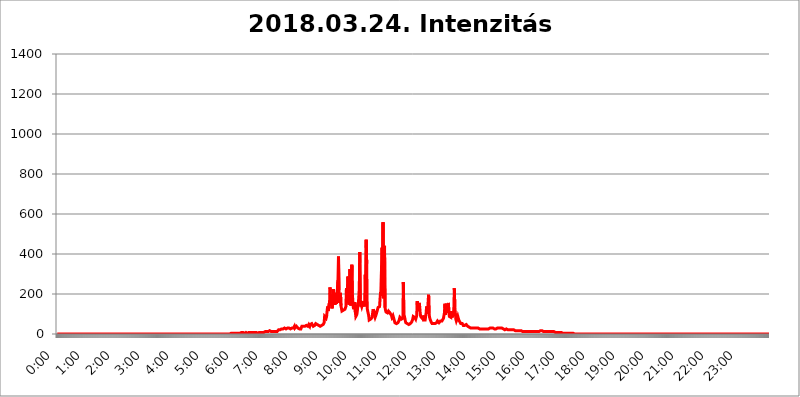
| Category | 2018.03.24. Intenzitás [W/m^2] |
|---|---|
| 0.0 | 0 |
| 0.0006944444444444445 | 0 |
| 0.001388888888888889 | 0 |
| 0.0020833333333333333 | 0 |
| 0.002777777777777778 | 0 |
| 0.003472222222222222 | 0 |
| 0.004166666666666667 | 0 |
| 0.004861111111111111 | 0 |
| 0.005555555555555556 | 0 |
| 0.0062499999999999995 | 0 |
| 0.006944444444444444 | 0 |
| 0.007638888888888889 | 0 |
| 0.008333333333333333 | 0 |
| 0.009027777777777779 | 0 |
| 0.009722222222222222 | 0 |
| 0.010416666666666666 | 0 |
| 0.011111111111111112 | 0 |
| 0.011805555555555555 | 0 |
| 0.012499999999999999 | 0 |
| 0.013194444444444444 | 0 |
| 0.013888888888888888 | 0 |
| 0.014583333333333332 | 0 |
| 0.015277777777777777 | 0 |
| 0.015972222222222224 | 0 |
| 0.016666666666666666 | 0 |
| 0.017361111111111112 | 0 |
| 0.018055555555555557 | 0 |
| 0.01875 | 0 |
| 0.019444444444444445 | 0 |
| 0.02013888888888889 | 0 |
| 0.020833333333333332 | 0 |
| 0.02152777777777778 | 0 |
| 0.022222222222222223 | 0 |
| 0.02291666666666667 | 0 |
| 0.02361111111111111 | 0 |
| 0.024305555555555556 | 0 |
| 0.024999999999999998 | 0 |
| 0.025694444444444447 | 0 |
| 0.02638888888888889 | 0 |
| 0.027083333333333334 | 0 |
| 0.027777777777777776 | 0 |
| 0.02847222222222222 | 0 |
| 0.029166666666666664 | 0 |
| 0.029861111111111113 | 0 |
| 0.030555555555555555 | 0 |
| 0.03125 | 0 |
| 0.03194444444444445 | 0 |
| 0.03263888888888889 | 0 |
| 0.03333333333333333 | 0 |
| 0.034027777777777775 | 0 |
| 0.034722222222222224 | 0 |
| 0.035416666666666666 | 0 |
| 0.036111111111111115 | 0 |
| 0.03680555555555556 | 0 |
| 0.0375 | 0 |
| 0.03819444444444444 | 0 |
| 0.03888888888888889 | 0 |
| 0.03958333333333333 | 0 |
| 0.04027777777777778 | 0 |
| 0.04097222222222222 | 0 |
| 0.041666666666666664 | 0 |
| 0.042361111111111106 | 0 |
| 0.04305555555555556 | 0 |
| 0.043750000000000004 | 0 |
| 0.044444444444444446 | 0 |
| 0.04513888888888889 | 0 |
| 0.04583333333333334 | 0 |
| 0.04652777777777778 | 0 |
| 0.04722222222222222 | 0 |
| 0.04791666666666666 | 0 |
| 0.04861111111111111 | 0 |
| 0.049305555555555554 | 0 |
| 0.049999999999999996 | 0 |
| 0.05069444444444445 | 0 |
| 0.051388888888888894 | 0 |
| 0.052083333333333336 | 0 |
| 0.05277777777777778 | 0 |
| 0.05347222222222222 | 0 |
| 0.05416666666666667 | 0 |
| 0.05486111111111111 | 0 |
| 0.05555555555555555 | 0 |
| 0.05625 | 0 |
| 0.05694444444444444 | 0 |
| 0.057638888888888885 | 0 |
| 0.05833333333333333 | 0 |
| 0.05902777777777778 | 0 |
| 0.059722222222222225 | 0 |
| 0.06041666666666667 | 0 |
| 0.061111111111111116 | 0 |
| 0.06180555555555556 | 0 |
| 0.0625 | 0 |
| 0.06319444444444444 | 0 |
| 0.06388888888888888 | 0 |
| 0.06458333333333334 | 0 |
| 0.06527777777777778 | 0 |
| 0.06597222222222222 | 0 |
| 0.06666666666666667 | 0 |
| 0.06736111111111111 | 0 |
| 0.06805555555555555 | 0 |
| 0.06874999999999999 | 0 |
| 0.06944444444444443 | 0 |
| 0.07013888888888889 | 0 |
| 0.07083333333333333 | 0 |
| 0.07152777777777779 | 0 |
| 0.07222222222222223 | 0 |
| 0.07291666666666667 | 0 |
| 0.07361111111111111 | 0 |
| 0.07430555555555556 | 0 |
| 0.075 | 0 |
| 0.07569444444444444 | 0 |
| 0.0763888888888889 | 0 |
| 0.07708333333333334 | 0 |
| 0.07777777777777778 | 0 |
| 0.07847222222222222 | 0 |
| 0.07916666666666666 | 0 |
| 0.0798611111111111 | 0 |
| 0.08055555555555556 | 0 |
| 0.08125 | 0 |
| 0.08194444444444444 | 0 |
| 0.08263888888888889 | 0 |
| 0.08333333333333333 | 0 |
| 0.08402777777777777 | 0 |
| 0.08472222222222221 | 0 |
| 0.08541666666666665 | 0 |
| 0.08611111111111112 | 0 |
| 0.08680555555555557 | 0 |
| 0.08750000000000001 | 0 |
| 0.08819444444444445 | 0 |
| 0.08888888888888889 | 0 |
| 0.08958333333333333 | 0 |
| 0.09027777777777778 | 0 |
| 0.09097222222222222 | 0 |
| 0.09166666666666667 | 0 |
| 0.09236111111111112 | 0 |
| 0.09305555555555556 | 0 |
| 0.09375 | 0 |
| 0.09444444444444444 | 0 |
| 0.09513888888888888 | 0 |
| 0.09583333333333333 | 0 |
| 0.09652777777777777 | 0 |
| 0.09722222222222222 | 0 |
| 0.09791666666666667 | 0 |
| 0.09861111111111111 | 0 |
| 0.09930555555555555 | 0 |
| 0.09999999999999999 | 0 |
| 0.10069444444444443 | 0 |
| 0.1013888888888889 | 0 |
| 0.10208333333333335 | 0 |
| 0.10277777777777779 | 0 |
| 0.10347222222222223 | 0 |
| 0.10416666666666667 | 0 |
| 0.10486111111111111 | 0 |
| 0.10555555555555556 | 0 |
| 0.10625 | 0 |
| 0.10694444444444444 | 0 |
| 0.1076388888888889 | 0 |
| 0.10833333333333334 | 0 |
| 0.10902777777777778 | 0 |
| 0.10972222222222222 | 0 |
| 0.1111111111111111 | 0 |
| 0.11180555555555556 | 0 |
| 0.11180555555555556 | 0 |
| 0.1125 | 0 |
| 0.11319444444444444 | 0 |
| 0.11388888888888889 | 0 |
| 0.11458333333333333 | 0 |
| 0.11527777777777777 | 0 |
| 0.11597222222222221 | 0 |
| 0.11666666666666665 | 0 |
| 0.1173611111111111 | 0 |
| 0.11805555555555557 | 0 |
| 0.11944444444444445 | 0 |
| 0.12013888888888889 | 0 |
| 0.12083333333333333 | 0 |
| 0.12152777777777778 | 0 |
| 0.12222222222222223 | 0 |
| 0.12291666666666667 | 0 |
| 0.12291666666666667 | 0 |
| 0.12361111111111112 | 0 |
| 0.12430555555555556 | 0 |
| 0.125 | 0 |
| 0.12569444444444444 | 0 |
| 0.12638888888888888 | 0 |
| 0.12708333333333333 | 0 |
| 0.16875 | 0 |
| 0.12847222222222224 | 0 |
| 0.12916666666666668 | 0 |
| 0.12986111111111112 | 0 |
| 0.13055555555555556 | 0 |
| 0.13125 | 0 |
| 0.13194444444444445 | 0 |
| 0.1326388888888889 | 0 |
| 0.13333333333333333 | 0 |
| 0.13402777777777777 | 0 |
| 0.13402777777777777 | 0 |
| 0.13472222222222222 | 0 |
| 0.13541666666666666 | 0 |
| 0.1361111111111111 | 0 |
| 0.13749999999999998 | 0 |
| 0.13819444444444443 | 0 |
| 0.1388888888888889 | 0 |
| 0.13958333333333334 | 0 |
| 0.14027777777777778 | 0 |
| 0.14097222222222222 | 0 |
| 0.14166666666666666 | 0 |
| 0.1423611111111111 | 0 |
| 0.14305555555555557 | 0 |
| 0.14375000000000002 | 0 |
| 0.14444444444444446 | 0 |
| 0.1451388888888889 | 0 |
| 0.1451388888888889 | 0 |
| 0.14652777777777778 | 0 |
| 0.14722222222222223 | 0 |
| 0.14791666666666667 | 0 |
| 0.1486111111111111 | 0 |
| 0.14930555555555555 | 0 |
| 0.15 | 0 |
| 0.15069444444444444 | 0 |
| 0.15138888888888888 | 0 |
| 0.15208333333333332 | 0 |
| 0.15277777777777776 | 0 |
| 0.15347222222222223 | 0 |
| 0.15416666666666667 | 0 |
| 0.15486111111111112 | 0 |
| 0.15555555555555556 | 0 |
| 0.15625 | 0 |
| 0.15694444444444444 | 0 |
| 0.15763888888888888 | 0 |
| 0.15833333333333333 | 0 |
| 0.15902777777777777 | 0 |
| 0.15972222222222224 | 0 |
| 0.16041666666666668 | 0 |
| 0.16111111111111112 | 0 |
| 0.16180555555555556 | 0 |
| 0.1625 | 0 |
| 0.16319444444444445 | 0 |
| 0.1638888888888889 | 0 |
| 0.16458333333333333 | 0 |
| 0.16527777777777777 | 0 |
| 0.16597222222222222 | 0 |
| 0.16666666666666666 | 0 |
| 0.1673611111111111 | 0 |
| 0.16805555555555554 | 0 |
| 0.16874999999999998 | 0 |
| 0.16944444444444443 | 0 |
| 0.17013888888888887 | 0 |
| 0.1708333333333333 | 0 |
| 0.17152777777777775 | 0 |
| 0.17222222222222225 | 0 |
| 0.1729166666666667 | 0 |
| 0.17361111111111113 | 0 |
| 0.17430555555555557 | 0 |
| 0.17500000000000002 | 0 |
| 0.17569444444444446 | 0 |
| 0.1763888888888889 | 0 |
| 0.17708333333333334 | 0 |
| 0.17777777777777778 | 0 |
| 0.17847222222222223 | 0 |
| 0.17916666666666667 | 0 |
| 0.1798611111111111 | 0 |
| 0.18055555555555555 | 0 |
| 0.18125 | 0 |
| 0.18194444444444444 | 0 |
| 0.1826388888888889 | 0 |
| 0.18333333333333335 | 0 |
| 0.1840277777777778 | 0 |
| 0.18472222222222223 | 0 |
| 0.18541666666666667 | 0 |
| 0.18611111111111112 | 0 |
| 0.18680555555555556 | 0 |
| 0.1875 | 0 |
| 0.18819444444444444 | 0 |
| 0.18888888888888888 | 0 |
| 0.18958333333333333 | 0 |
| 0.19027777777777777 | 0 |
| 0.1909722222222222 | 0 |
| 0.19166666666666665 | 0 |
| 0.19236111111111112 | 0 |
| 0.19305555555555554 | 0 |
| 0.19375 | 0 |
| 0.19444444444444445 | 0 |
| 0.1951388888888889 | 0 |
| 0.19583333333333333 | 0 |
| 0.19652777777777777 | 0 |
| 0.19722222222222222 | 0 |
| 0.19791666666666666 | 0 |
| 0.1986111111111111 | 0 |
| 0.19930555555555554 | 0 |
| 0.19999999999999998 | 0 |
| 0.20069444444444443 | 0 |
| 0.20138888888888887 | 0 |
| 0.2020833333333333 | 0 |
| 0.2027777777777778 | 0 |
| 0.2034722222222222 | 0 |
| 0.2041666666666667 | 0 |
| 0.20486111111111113 | 0 |
| 0.20555555555555557 | 0 |
| 0.20625000000000002 | 0 |
| 0.20694444444444446 | 0 |
| 0.2076388888888889 | 0 |
| 0.20833333333333334 | 0 |
| 0.20902777777777778 | 0 |
| 0.20972222222222223 | 0 |
| 0.21041666666666667 | 0 |
| 0.2111111111111111 | 0 |
| 0.21180555555555555 | 0 |
| 0.2125 | 0 |
| 0.21319444444444444 | 0 |
| 0.2138888888888889 | 0 |
| 0.21458333333333335 | 0 |
| 0.2152777777777778 | 0 |
| 0.21597222222222223 | 0 |
| 0.21666666666666667 | 0 |
| 0.21736111111111112 | 0 |
| 0.21805555555555556 | 0 |
| 0.21875 | 0 |
| 0.21944444444444444 | 0 |
| 0.22013888888888888 | 0 |
| 0.22083333333333333 | 0 |
| 0.22152777777777777 | 0 |
| 0.2222222222222222 | 0 |
| 0.22291666666666665 | 0 |
| 0.2236111111111111 | 0 |
| 0.22430555555555556 | 0 |
| 0.225 | 0 |
| 0.22569444444444445 | 0 |
| 0.2263888888888889 | 0 |
| 0.22708333333333333 | 0 |
| 0.22777777777777777 | 0 |
| 0.22847222222222222 | 0 |
| 0.22916666666666666 | 0 |
| 0.2298611111111111 | 0 |
| 0.23055555555555554 | 0 |
| 0.23124999999999998 | 0 |
| 0.23194444444444443 | 0 |
| 0.23263888888888887 | 0 |
| 0.2333333333333333 | 0 |
| 0.2340277777777778 | 0 |
| 0.2347222222222222 | 0 |
| 0.2354166666666667 | 0 |
| 0.23611111111111113 | 0 |
| 0.23680555555555557 | 0 |
| 0.23750000000000002 | 0 |
| 0.23819444444444446 | 0 |
| 0.2388888888888889 | 0 |
| 0.23958333333333334 | 0 |
| 0.24027777777777778 | 0 |
| 0.24097222222222223 | 0 |
| 0.24166666666666667 | 0 |
| 0.2423611111111111 | 0 |
| 0.24305555555555555 | 0 |
| 0.24375 | 3.525 |
| 0.24444444444444446 | 3.525 |
| 0.24513888888888888 | 3.525 |
| 0.24583333333333335 | 3.525 |
| 0.2465277777777778 | 0 |
| 0.24722222222222223 | 3.525 |
| 0.24791666666666667 | 3.525 |
| 0.24861111111111112 | 3.525 |
| 0.24930555555555556 | 3.525 |
| 0.25 | 3.525 |
| 0.25069444444444444 | 3.525 |
| 0.2513888888888889 | 3.525 |
| 0.2520833333333333 | 3.525 |
| 0.25277777777777777 | 3.525 |
| 0.2534722222222222 | 3.525 |
| 0.25416666666666665 | 3.525 |
| 0.2548611111111111 | 3.525 |
| 0.2555555555555556 | 3.525 |
| 0.25625000000000003 | 3.525 |
| 0.2569444444444445 | 3.525 |
| 0.2576388888888889 | 3.525 |
| 0.25833333333333336 | 7.887 |
| 0.2590277777777778 | 7.887 |
| 0.25972222222222224 | 7.887 |
| 0.2604166666666667 | 7.887 |
| 0.2611111111111111 | 3.525 |
| 0.26180555555555557 | 3.525 |
| 0.2625 | 3.525 |
| 0.26319444444444445 | 7.887 |
| 0.2638888888888889 | 7.887 |
| 0.26458333333333334 | 7.887 |
| 0.2652777777777778 | 3.525 |
| 0.2659722222222222 | 3.525 |
| 0.26666666666666666 | 3.525 |
| 0.2673611111111111 | 7.887 |
| 0.26805555555555555 | 7.887 |
| 0.26875 | 7.887 |
| 0.26944444444444443 | 7.887 |
| 0.2701388888888889 | 7.887 |
| 0.2708333333333333 | 7.887 |
| 0.27152777777777776 | 7.887 |
| 0.2722222222222222 | 12.257 |
| 0.27291666666666664 | 7.887 |
| 0.2736111111111111 | 7.887 |
| 0.2743055555555555 | 7.887 |
| 0.27499999999999997 | 7.887 |
| 0.27569444444444446 | 7.887 |
| 0.27638888888888885 | 7.887 |
| 0.27708333333333335 | 7.887 |
| 0.2777777777777778 | 7.887 |
| 0.27847222222222223 | 7.887 |
| 0.2791666666666667 | 7.887 |
| 0.2798611111111111 | 7.887 |
| 0.28055555555555556 | 7.887 |
| 0.28125 | 3.525 |
| 0.28194444444444444 | 3.525 |
| 0.2826388888888889 | 7.887 |
| 0.2833333333333333 | 7.887 |
| 0.28402777777777777 | 7.887 |
| 0.2847222222222222 | 12.257 |
| 0.28541666666666665 | 7.887 |
| 0.28611111111111115 | 12.257 |
| 0.28680555555555554 | 7.887 |
| 0.28750000000000003 | 7.887 |
| 0.2881944444444445 | 7.887 |
| 0.2888888888888889 | 7.887 |
| 0.28958333333333336 | 7.887 |
| 0.2902777777777778 | 12.257 |
| 0.29097222222222224 | 12.257 |
| 0.2916666666666667 | 12.257 |
| 0.2923611111111111 | 12.257 |
| 0.29305555555555557 | 12.257 |
| 0.29375 | 12.257 |
| 0.29444444444444445 | 12.257 |
| 0.2951388888888889 | 12.257 |
| 0.29583333333333334 | 12.257 |
| 0.2965277777777778 | 12.257 |
| 0.2972222222222222 | 12.257 |
| 0.29791666666666666 | 16.636 |
| 0.2986111111111111 | 16.636 |
| 0.29930555555555555 | 16.636 |
| 0.3 | 12.257 |
| 0.30069444444444443 | 12.257 |
| 0.3013888888888889 | 12.257 |
| 0.3020833333333333 | 12.257 |
| 0.30277777777777776 | 12.257 |
| 0.3034722222222222 | 12.257 |
| 0.30416666666666664 | 12.257 |
| 0.3048611111111111 | 12.257 |
| 0.3055555555555555 | 12.257 |
| 0.30624999999999997 | 12.257 |
| 0.3069444444444444 | 16.636 |
| 0.3076388888888889 | 16.636 |
| 0.30833333333333335 | 12.257 |
| 0.3090277777777778 | 12.257 |
| 0.30972222222222223 | 16.636 |
| 0.3104166666666667 | 21.024 |
| 0.3111111111111111 | 21.024 |
| 0.31180555555555556 | 21.024 |
| 0.3125 | 21.024 |
| 0.31319444444444444 | 25.419 |
| 0.3138888888888889 | 25.419 |
| 0.3145833333333333 | 25.419 |
| 0.31527777777777777 | 21.024 |
| 0.3159722222222222 | 21.024 |
| 0.31666666666666665 | 25.419 |
| 0.31736111111111115 | 29.823 |
| 0.31805555555555554 | 29.823 |
| 0.31875000000000003 | 29.823 |
| 0.3194444444444445 | 29.823 |
| 0.3201388888888889 | 25.419 |
| 0.32083333333333336 | 25.419 |
| 0.3215277777777778 | 25.419 |
| 0.32222222222222224 | 25.419 |
| 0.3229166666666667 | 29.823 |
| 0.3236111111111111 | 29.823 |
| 0.32430555555555557 | 29.823 |
| 0.325 | 29.823 |
| 0.32569444444444445 | 29.823 |
| 0.3263888888888889 | 29.823 |
| 0.32708333333333334 | 25.419 |
| 0.3277777777777778 | 29.823 |
| 0.3284722222222222 | 29.823 |
| 0.32916666666666666 | 29.823 |
| 0.3298611111111111 | 29.823 |
| 0.33055555555555555 | 29.823 |
| 0.33125 | 29.823 |
| 0.33194444444444443 | 34.234 |
| 0.3326388888888889 | 38.653 |
| 0.3333333333333333 | 29.823 |
| 0.3340277777777778 | 29.823 |
| 0.3347222222222222 | 34.234 |
| 0.3354166666666667 | 38.653 |
| 0.3361111111111111 | 43.079 |
| 0.3368055555555556 | 38.653 |
| 0.33749999999999997 | 29.823 |
| 0.33819444444444446 | 25.419 |
| 0.33888888888888885 | 25.419 |
| 0.33958333333333335 | 25.419 |
| 0.34027777777777773 | 25.419 |
| 0.34097222222222223 | 25.419 |
| 0.3416666666666666 | 25.419 |
| 0.3423611111111111 | 29.823 |
| 0.3430555555555555 | 38.653 |
| 0.34375 | 38.653 |
| 0.3444444444444445 | 43.079 |
| 0.3451388888888889 | 38.653 |
| 0.3458333333333334 | 38.653 |
| 0.34652777777777777 | 38.653 |
| 0.34722222222222227 | 38.653 |
| 0.34791666666666665 | 38.653 |
| 0.34861111111111115 | 38.653 |
| 0.34930555555555554 | 43.079 |
| 0.35000000000000003 | 38.653 |
| 0.3506944444444444 | 38.653 |
| 0.3513888888888889 | 38.653 |
| 0.3520833333333333 | 43.079 |
| 0.3527777777777778 | 47.511 |
| 0.3534722222222222 | 43.079 |
| 0.3541666666666667 | 38.653 |
| 0.3548611111111111 | 47.511 |
| 0.35555555555555557 | 51.951 |
| 0.35625 | 47.511 |
| 0.35694444444444445 | 51.951 |
| 0.3576388888888889 | 56.398 |
| 0.35833333333333334 | 47.511 |
| 0.3590277777777778 | 38.653 |
| 0.3597222222222222 | 43.079 |
| 0.36041666666666666 | 43.079 |
| 0.3611111111111111 | 43.079 |
| 0.36180555555555555 | 47.511 |
| 0.3625 | 51.951 |
| 0.36319444444444443 | 47.511 |
| 0.3638888888888889 | 47.511 |
| 0.3645833333333333 | 47.511 |
| 0.3652777777777778 | 43.079 |
| 0.3659722222222222 | 43.079 |
| 0.3666666666666667 | 43.079 |
| 0.3673611111111111 | 38.653 |
| 0.3680555555555556 | 38.653 |
| 0.36874999999999997 | 38.653 |
| 0.36944444444444446 | 43.079 |
| 0.37013888888888885 | 43.079 |
| 0.37083333333333335 | 43.079 |
| 0.37152777777777773 | 47.511 |
| 0.37222222222222223 | 47.511 |
| 0.3729166666666666 | 47.511 |
| 0.3736111111111111 | 51.951 |
| 0.3743055555555555 | 56.398 |
| 0.375 | 87.692 |
| 0.3756944444444445 | 83.205 |
| 0.3763888888888889 | 92.184 |
| 0.3770833333333334 | 78.722 |
| 0.37777777777777777 | 87.692 |
| 0.37847222222222227 | 114.716 |
| 0.37916666666666665 | 137.347 |
| 0.37986111111111115 | 114.716 |
| 0.38055555555555554 | 114.716 |
| 0.38125000000000003 | 119.235 |
| 0.3819444444444444 | 160.056 |
| 0.3826388888888889 | 233 |
| 0.3833333333333333 | 178.264 |
| 0.3840277777777778 | 141.884 |
| 0.3847222222222222 | 164.605 |
| 0.3854166666666667 | 128.284 |
| 0.3861111111111111 | 128.284 |
| 0.38680555555555557 | 173.709 |
| 0.3875 | 223.873 |
| 0.38819444444444445 | 150.964 |
| 0.3888888888888889 | 164.605 |
| 0.38958333333333334 | 146.423 |
| 0.3902777777777778 | 178.264 |
| 0.3909722222222222 | 205.62 |
| 0.39166666666666666 | 150.964 |
| 0.3923611111111111 | 146.423 |
| 0.39305555555555555 | 155.509 |
| 0.39375 | 269.49 |
| 0.39444444444444443 | 387.202 |
| 0.3951388888888889 | 219.309 |
| 0.3958333333333333 | 155.509 |
| 0.3965277777777778 | 196.497 |
| 0.3972222222222222 | 205.62 |
| 0.3979166666666667 | 141.884 |
| 0.3986111111111111 | 128.284 |
| 0.3993055555555556 | 114.716 |
| 0.39999999999999997 | 110.201 |
| 0.40069444444444446 | 114.716 |
| 0.40138888888888885 | 119.235 |
| 0.40208333333333335 | 123.758 |
| 0.40277777777777773 | 123.758 |
| 0.40347222222222223 | 123.758 |
| 0.4041666666666666 | 128.284 |
| 0.4048611111111111 | 137.347 |
| 0.4055555555555555 | 228.436 |
| 0.40625 | 182.82 |
| 0.4069444444444445 | 214.746 |
| 0.4076388888888889 | 287.709 |
| 0.4083333333333334 | 164.605 |
| 0.40902777777777777 | 146.423 |
| 0.40972222222222227 | 155.509 |
| 0.41041666666666665 | 324.052 |
| 0.41111111111111115 | 155.509 |
| 0.41180555555555554 | 141.884 |
| 0.41250000000000003 | 141.884 |
| 0.4131944444444444 | 346.682 |
| 0.4138888888888889 | 201.058 |
| 0.4145833333333333 | 164.605 |
| 0.4152777777777778 | 132.814 |
| 0.4159722222222222 | 123.758 |
| 0.4166666666666667 | 137.347 |
| 0.4173611111111111 | 160.056 |
| 0.41805555555555557 | 110.201 |
| 0.41875 | 87.692 |
| 0.41944444444444445 | 83.205 |
| 0.4201388888888889 | 96.682 |
| 0.42083333333333334 | 114.716 |
| 0.4215277777777778 | 137.347 |
| 0.4222222222222222 | 150.964 |
| 0.42291666666666666 | 182.82 |
| 0.4236111111111111 | 228.436 |
| 0.42430555555555555 | 409.574 |
| 0.425 | 173.709 |
| 0.42569444444444443 | 137.347 |
| 0.4263888888888889 | 146.423 |
| 0.4270833333333333 | 137.347 |
| 0.4277777777777778 | 141.884 |
| 0.4284722222222222 | 155.509 |
| 0.4291666666666667 | 164.605 |
| 0.4298611111111111 | 146.423 |
| 0.4305555555555556 | 137.347 |
| 0.43124999999999997 | 164.605 |
| 0.43194444444444446 | 296.808 |
| 0.43263888888888885 | 219.309 |
| 0.43333333333333335 | 471.582 |
| 0.43402777777777773 | 351.198 |
| 0.43472222222222223 | 128.284 |
| 0.4354166666666666 | 114.716 |
| 0.4361111111111111 | 114.716 |
| 0.4368055555555555 | 92.184 |
| 0.4375 | 69.775 |
| 0.4381944444444445 | 65.31 |
| 0.4388888888888889 | 65.31 |
| 0.4395833333333334 | 74.246 |
| 0.44027777777777777 | 78.722 |
| 0.44097222222222227 | 78.722 |
| 0.44166666666666665 | 83.205 |
| 0.44236111111111115 | 105.69 |
| 0.44305555555555554 | 123.758 |
| 0.44375000000000003 | 123.758 |
| 0.4444444444444444 | 110.201 |
| 0.4451388888888889 | 92.184 |
| 0.4458333333333333 | 83.205 |
| 0.4465277777777778 | 87.692 |
| 0.4472222222222222 | 96.682 |
| 0.4479166666666667 | 105.69 |
| 0.4486111111111111 | 114.716 |
| 0.44930555555555557 | 123.758 |
| 0.45 | 132.814 |
| 0.45069444444444445 | 128.284 |
| 0.4513888888888889 | 128.284 |
| 0.45208333333333334 | 137.347 |
| 0.4527777777777778 | 178.264 |
| 0.4534722222222222 | 210.182 |
| 0.45416666666666666 | 191.937 |
| 0.4548611111111111 | 342.162 |
| 0.45555555555555555 | 431.833 |
| 0.45625 | 264.932 |
| 0.45694444444444443 | 558.261 |
| 0.4576388888888889 | 178.264 |
| 0.4583333333333333 | 396.164 |
| 0.4590277777777778 | 440.702 |
| 0.4597222222222222 | 132.814 |
| 0.4604166666666667 | 119.235 |
| 0.4611111111111111 | 110.201 |
| 0.4618055555555556 | 110.201 |
| 0.46249999999999997 | 110.201 |
| 0.46319444444444446 | 105.69 |
| 0.46388888888888885 | 110.201 |
| 0.46458333333333335 | 114.716 |
| 0.46527777777777773 | 110.201 |
| 0.46597222222222223 | 119.235 |
| 0.4666666666666666 | 105.69 |
| 0.4673611111111111 | 105.69 |
| 0.4680555555555555 | 101.184 |
| 0.46875 | 92.184 |
| 0.4694444444444445 | 83.205 |
| 0.4701388888888889 | 87.692 |
| 0.4708333333333334 | 92.184 |
| 0.47152777777777777 | 87.692 |
| 0.47222222222222227 | 74.246 |
| 0.47291666666666665 | 65.31 |
| 0.47361111111111115 | 56.398 |
| 0.47430555555555554 | 51.951 |
| 0.47500000000000003 | 51.951 |
| 0.4756944444444444 | 51.951 |
| 0.4763888888888889 | 56.398 |
| 0.4770833333333333 | 56.398 |
| 0.4777777777777778 | 56.398 |
| 0.4784722222222222 | 60.85 |
| 0.4791666666666667 | 65.31 |
| 0.4798611111111111 | 74.246 |
| 0.48055555555555557 | 83.205 |
| 0.48125 | 83.205 |
| 0.48194444444444445 | 78.722 |
| 0.4826388888888889 | 74.246 |
| 0.48333333333333334 | 69.775 |
| 0.4840277777777778 | 69.775 |
| 0.4847222222222222 | 78.722 |
| 0.48541666666666666 | 260.373 |
| 0.4861111111111111 | 101.184 |
| 0.48680555555555555 | 96.682 |
| 0.4875 | 78.722 |
| 0.48819444444444443 | 65.31 |
| 0.4888888888888889 | 56.398 |
| 0.4895833333333333 | 51.951 |
| 0.4902777777777778 | 51.951 |
| 0.4909722222222222 | 51.951 |
| 0.4916666666666667 | 47.511 |
| 0.4923611111111111 | 47.511 |
| 0.4930555555555556 | 47.511 |
| 0.49374999999999997 | 47.511 |
| 0.49444444444444446 | 51.951 |
| 0.49513888888888885 | 51.951 |
| 0.49583333333333335 | 51.951 |
| 0.49652777777777773 | 56.398 |
| 0.49722222222222223 | 60.85 |
| 0.4979166666666666 | 65.31 |
| 0.4986111111111111 | 74.246 |
| 0.4993055555555555 | 87.692 |
| 0.5 | 92.184 |
| 0.5006944444444444 | 83.205 |
| 0.5013888888888889 | 83.205 |
| 0.5020833333333333 | 78.722 |
| 0.5027777777777778 | 74.246 |
| 0.5034722222222222 | 78.722 |
| 0.5041666666666667 | 92.184 |
| 0.5048611111111111 | 164.605 |
| 0.5055555555555555 | 114.716 |
| 0.50625 | 114.716 |
| 0.5069444444444444 | 132.814 |
| 0.5076388888888889 | 155.509 |
| 0.5083333333333333 | 137.347 |
| 0.5090277777777777 | 105.69 |
| 0.5097222222222222 | 87.692 |
| 0.5104166666666666 | 83.205 |
| 0.5111111111111112 | 83.205 |
| 0.5118055555555555 | 78.722 |
| 0.5125000000000001 | 92.184 |
| 0.5131944444444444 | 83.205 |
| 0.513888888888889 | 69.775 |
| 0.5145833333333333 | 65.31 |
| 0.5152777777777778 | 65.31 |
| 0.5159722222222222 | 69.775 |
| 0.5166666666666667 | 74.246 |
| 0.517361111111111 | 105.69 |
| 0.5180555555555556 | 137.347 |
| 0.5187499999999999 | 101.184 |
| 0.5194444444444445 | 119.235 |
| 0.5201388888888888 | 123.758 |
| 0.5208333333333334 | 196.497 |
| 0.5215277777777778 | 101.184 |
| 0.5222222222222223 | 83.205 |
| 0.5229166666666667 | 74.246 |
| 0.5236111111111111 | 69.775 |
| 0.5243055555555556 | 60.85 |
| 0.525 | 56.398 |
| 0.5256944444444445 | 51.951 |
| 0.5263888888888889 | 51.951 |
| 0.5270833333333333 | 51.951 |
| 0.5277777777777778 | 51.951 |
| 0.5284722222222222 | 51.951 |
| 0.5291666666666667 | 51.951 |
| 0.5298611111111111 | 51.951 |
| 0.5305555555555556 | 51.951 |
| 0.53125 | 56.398 |
| 0.5319444444444444 | 56.398 |
| 0.5326388888888889 | 60.85 |
| 0.5333333333333333 | 65.31 |
| 0.5340277777777778 | 60.85 |
| 0.5347222222222222 | 60.85 |
| 0.5354166666666667 | 56.398 |
| 0.5361111111111111 | 56.398 |
| 0.5368055555555555 | 60.85 |
| 0.5375 | 65.31 |
| 0.5381944444444444 | 65.31 |
| 0.5388888888888889 | 65.31 |
| 0.5395833333333333 | 65.31 |
| 0.5402777777777777 | 65.31 |
| 0.5409722222222222 | 69.775 |
| 0.5416666666666666 | 78.722 |
| 0.5423611111111112 | 92.184 |
| 0.5430555555555555 | 105.69 |
| 0.5437500000000001 | 150.964 |
| 0.5444444444444444 | 96.682 |
| 0.545138888888889 | 101.184 |
| 0.5458333333333333 | 150.964 |
| 0.5465277777777778 | 105.69 |
| 0.5472222222222222 | 105.69 |
| 0.5479166666666667 | 119.235 |
| 0.548611111111111 | 155.509 |
| 0.5493055555555556 | 105.69 |
| 0.5499999999999999 | 87.692 |
| 0.5506944444444445 | 92.184 |
| 0.5513888888888888 | 87.692 |
| 0.5520833333333334 | 83.205 |
| 0.5527777777777778 | 114.716 |
| 0.5534722222222223 | 83.205 |
| 0.5541666666666667 | 78.722 |
| 0.5548611111111111 | 87.692 |
| 0.5555555555555556 | 101.184 |
| 0.55625 | 128.284 |
| 0.5569444444444445 | 228.436 |
| 0.5576388888888889 | 132.814 |
| 0.5583333333333333 | 105.69 |
| 0.5590277777777778 | 74.246 |
| 0.5597222222222222 | 65.31 |
| 0.5604166666666667 | 69.775 |
| 0.5611111111111111 | 78.722 |
| 0.5618055555555556 | 87.692 |
| 0.5625 | 83.205 |
| 0.5631944444444444 | 69.775 |
| 0.5638888888888889 | 65.31 |
| 0.5645833333333333 | 60.85 |
| 0.5652777777777778 | 56.398 |
| 0.5659722222222222 | 51.951 |
| 0.5666666666666667 | 51.951 |
| 0.5673611111111111 | 51.951 |
| 0.5680555555555555 | 51.951 |
| 0.56875 | 47.511 |
| 0.5694444444444444 | 43.079 |
| 0.5701388888888889 | 43.079 |
| 0.5708333333333333 | 43.079 |
| 0.5715277777777777 | 43.079 |
| 0.5722222222222222 | 47.511 |
| 0.5729166666666666 | 47.511 |
| 0.5736111111111112 | 47.511 |
| 0.5743055555555555 | 43.079 |
| 0.5750000000000001 | 43.079 |
| 0.5756944444444444 | 38.653 |
| 0.576388888888889 | 38.653 |
| 0.5770833333333333 | 38.653 |
| 0.5777777777777778 | 34.234 |
| 0.5784722222222222 | 34.234 |
| 0.5791666666666667 | 29.823 |
| 0.579861111111111 | 29.823 |
| 0.5805555555555556 | 29.823 |
| 0.5812499999999999 | 29.823 |
| 0.5819444444444445 | 29.823 |
| 0.5826388888888888 | 29.823 |
| 0.5833333333333334 | 29.823 |
| 0.5840277777777778 | 29.823 |
| 0.5847222222222223 | 29.823 |
| 0.5854166666666667 | 29.823 |
| 0.5861111111111111 | 29.823 |
| 0.5868055555555556 | 29.823 |
| 0.5875 | 29.823 |
| 0.5881944444444445 | 29.823 |
| 0.5888888888888889 | 29.823 |
| 0.5895833333333333 | 29.823 |
| 0.5902777777777778 | 29.823 |
| 0.5909722222222222 | 25.419 |
| 0.5916666666666667 | 25.419 |
| 0.5923611111111111 | 25.419 |
| 0.5930555555555556 | 25.419 |
| 0.59375 | 25.419 |
| 0.5944444444444444 | 25.419 |
| 0.5951388888888889 | 25.419 |
| 0.5958333333333333 | 25.419 |
| 0.5965277777777778 | 25.419 |
| 0.5972222222222222 | 25.419 |
| 0.5979166666666667 | 25.419 |
| 0.5986111111111111 | 25.419 |
| 0.5993055555555555 | 25.419 |
| 0.6 | 25.419 |
| 0.6006944444444444 | 25.419 |
| 0.6013888888888889 | 25.419 |
| 0.6020833333333333 | 25.419 |
| 0.6027777777777777 | 25.419 |
| 0.6034722222222222 | 25.419 |
| 0.6041666666666666 | 29.823 |
| 0.6048611111111112 | 25.419 |
| 0.6055555555555555 | 29.823 |
| 0.6062500000000001 | 29.823 |
| 0.6069444444444444 | 29.823 |
| 0.607638888888889 | 29.823 |
| 0.6083333333333333 | 29.823 |
| 0.6090277777777778 | 29.823 |
| 0.6097222222222222 | 29.823 |
| 0.6104166666666667 | 29.823 |
| 0.611111111111111 | 29.823 |
| 0.6118055555555556 | 25.419 |
| 0.6124999999999999 | 25.419 |
| 0.6131944444444445 | 25.419 |
| 0.6138888888888888 | 25.419 |
| 0.6145833333333334 | 25.419 |
| 0.6152777777777778 | 25.419 |
| 0.6159722222222223 | 29.823 |
| 0.6166666666666667 | 29.823 |
| 0.6173611111111111 | 29.823 |
| 0.6180555555555556 | 29.823 |
| 0.61875 | 29.823 |
| 0.6194444444444445 | 29.823 |
| 0.6201388888888889 | 29.823 |
| 0.6208333333333333 | 29.823 |
| 0.6215277777777778 | 29.823 |
| 0.6222222222222222 | 29.823 |
| 0.6229166666666667 | 29.823 |
| 0.6236111111111111 | 29.823 |
| 0.6243055555555556 | 29.823 |
| 0.625 | 25.419 |
| 0.6256944444444444 | 25.419 |
| 0.6263888888888889 | 25.419 |
| 0.6270833333333333 | 25.419 |
| 0.6277777777777778 | 21.024 |
| 0.6284722222222222 | 25.419 |
| 0.6291666666666667 | 25.419 |
| 0.6298611111111111 | 25.419 |
| 0.6305555555555555 | 21.024 |
| 0.63125 | 25.419 |
| 0.6319444444444444 | 21.024 |
| 0.6326388888888889 | 21.024 |
| 0.6333333333333333 | 21.024 |
| 0.6340277777777777 | 21.024 |
| 0.6347222222222222 | 21.024 |
| 0.6354166666666666 | 21.024 |
| 0.6361111111111112 | 21.024 |
| 0.6368055555555555 | 21.024 |
| 0.6375000000000001 | 21.024 |
| 0.6381944444444444 | 21.024 |
| 0.638888888888889 | 21.024 |
| 0.6395833333333333 | 21.024 |
| 0.6402777777777778 | 21.024 |
| 0.6409722222222222 | 21.024 |
| 0.6416666666666667 | 16.636 |
| 0.642361111111111 | 16.636 |
| 0.6430555555555556 | 16.636 |
| 0.6437499999999999 | 16.636 |
| 0.6444444444444445 | 16.636 |
| 0.6451388888888888 | 16.636 |
| 0.6458333333333334 | 16.636 |
| 0.6465277777777778 | 16.636 |
| 0.6472222222222223 | 16.636 |
| 0.6479166666666667 | 16.636 |
| 0.6486111111111111 | 16.636 |
| 0.6493055555555556 | 16.636 |
| 0.65 | 16.636 |
| 0.6506944444444445 | 16.636 |
| 0.6513888888888889 | 12.257 |
| 0.6520833333333333 | 12.257 |
| 0.6527777777777778 | 12.257 |
| 0.6534722222222222 | 12.257 |
| 0.6541666666666667 | 12.257 |
| 0.6548611111111111 | 12.257 |
| 0.6555555555555556 | 12.257 |
| 0.65625 | 12.257 |
| 0.6569444444444444 | 12.257 |
| 0.6576388888888889 | 12.257 |
| 0.6583333333333333 | 12.257 |
| 0.6590277777777778 | 12.257 |
| 0.6597222222222222 | 12.257 |
| 0.6604166666666667 | 12.257 |
| 0.6611111111111111 | 12.257 |
| 0.6618055555555555 | 12.257 |
| 0.6625 | 12.257 |
| 0.6631944444444444 | 12.257 |
| 0.6638888888888889 | 12.257 |
| 0.6645833333333333 | 12.257 |
| 0.6652777777777777 | 12.257 |
| 0.6659722222222222 | 12.257 |
| 0.6666666666666666 | 12.257 |
| 0.6673611111111111 | 12.257 |
| 0.6680555555555556 | 12.257 |
| 0.6687500000000001 | 12.257 |
| 0.6694444444444444 | 12.257 |
| 0.6701388888888888 | 12.257 |
| 0.6708333333333334 | 12.257 |
| 0.6715277777777778 | 12.257 |
| 0.6722222222222222 | 12.257 |
| 0.6729166666666666 | 12.257 |
| 0.6736111111111112 | 12.257 |
| 0.6743055555555556 | 12.257 |
| 0.6749999999999999 | 16.636 |
| 0.6756944444444444 | 12.257 |
| 0.6763888888888889 | 16.636 |
| 0.6770833333333334 | 16.636 |
| 0.6777777777777777 | 16.636 |
| 0.6784722222222223 | 16.636 |
| 0.6791666666666667 | 16.636 |
| 0.6798611111111111 | 16.636 |
| 0.6805555555555555 | 16.636 |
| 0.68125 | 16.636 |
| 0.6819444444444445 | 12.257 |
| 0.6826388888888889 | 12.257 |
| 0.6833333333333332 | 12.257 |
| 0.6840277777777778 | 12.257 |
| 0.6847222222222222 | 12.257 |
| 0.6854166666666667 | 12.257 |
| 0.686111111111111 | 12.257 |
| 0.6868055555555556 | 12.257 |
| 0.6875 | 12.257 |
| 0.6881944444444444 | 12.257 |
| 0.688888888888889 | 12.257 |
| 0.6895833333333333 | 12.257 |
| 0.6902777777777778 | 12.257 |
| 0.6909722222222222 | 12.257 |
| 0.6916666666666668 | 12.257 |
| 0.6923611111111111 | 12.257 |
| 0.6930555555555555 | 12.257 |
| 0.69375 | 12.257 |
| 0.6944444444444445 | 12.257 |
| 0.6951388888888889 | 12.257 |
| 0.6958333333333333 | 12.257 |
| 0.6965277777777777 | 12.257 |
| 0.6972222222222223 | 7.887 |
| 0.6979166666666666 | 7.887 |
| 0.6986111111111111 | 7.887 |
| 0.6993055555555556 | 7.887 |
| 0.7000000000000001 | 7.887 |
| 0.7006944444444444 | 7.887 |
| 0.7013888888888888 | 7.887 |
| 0.7020833333333334 | 7.887 |
| 0.7027777777777778 | 7.887 |
| 0.7034722222222222 | 7.887 |
| 0.7041666666666666 | 7.887 |
| 0.7048611111111112 | 7.887 |
| 0.7055555555555556 | 7.887 |
| 0.7062499999999999 | 7.887 |
| 0.7069444444444444 | 7.887 |
| 0.7076388888888889 | 3.525 |
| 0.7083333333333334 | 3.525 |
| 0.7090277777777777 | 3.525 |
| 0.7097222222222223 | 3.525 |
| 0.7104166666666667 | 3.525 |
| 0.7111111111111111 | 3.525 |
| 0.7118055555555555 | 3.525 |
| 0.7125 | 3.525 |
| 0.7131944444444445 | 3.525 |
| 0.7138888888888889 | 3.525 |
| 0.7145833333333332 | 3.525 |
| 0.7152777777777778 | 3.525 |
| 0.7159722222222222 | 3.525 |
| 0.7166666666666667 | 3.525 |
| 0.717361111111111 | 3.525 |
| 0.7180555555555556 | 3.525 |
| 0.71875 | 3.525 |
| 0.7194444444444444 | 3.525 |
| 0.720138888888889 | 3.525 |
| 0.7208333333333333 | 3.525 |
| 0.7215277777777778 | 3.525 |
| 0.7222222222222222 | 3.525 |
| 0.7229166666666668 | 3.525 |
| 0.7236111111111111 | 3.525 |
| 0.7243055555555555 | 0 |
| 0.725 | 0 |
| 0.7256944444444445 | 0 |
| 0.7263888888888889 | 0 |
| 0.7270833333333333 | 3.525 |
| 0.7277777777777777 | 0 |
| 0.7284722222222223 | 0 |
| 0.7291666666666666 | 0 |
| 0.7298611111111111 | 0 |
| 0.7305555555555556 | 0 |
| 0.7312500000000001 | 0 |
| 0.7319444444444444 | 0 |
| 0.7326388888888888 | 0 |
| 0.7333333333333334 | 0 |
| 0.7340277777777778 | 0 |
| 0.7347222222222222 | 0 |
| 0.7354166666666666 | 0 |
| 0.7361111111111112 | 0 |
| 0.7368055555555556 | 0 |
| 0.7374999999999999 | 0 |
| 0.7381944444444444 | 0 |
| 0.7388888888888889 | 0 |
| 0.7395833333333334 | 0 |
| 0.7402777777777777 | 0 |
| 0.7409722222222223 | 0 |
| 0.7416666666666667 | 0 |
| 0.7423611111111111 | 0 |
| 0.7430555555555555 | 0 |
| 0.74375 | 0 |
| 0.7444444444444445 | 0 |
| 0.7451388888888889 | 0 |
| 0.7458333333333332 | 0 |
| 0.7465277777777778 | 0 |
| 0.7472222222222222 | 0 |
| 0.7479166666666667 | 0 |
| 0.748611111111111 | 0 |
| 0.7493055555555556 | 0 |
| 0.75 | 0 |
| 0.7506944444444444 | 0 |
| 0.751388888888889 | 0 |
| 0.7520833333333333 | 0 |
| 0.7527777777777778 | 0 |
| 0.7534722222222222 | 0 |
| 0.7541666666666668 | 0 |
| 0.7548611111111111 | 0 |
| 0.7555555555555555 | 0 |
| 0.75625 | 0 |
| 0.7569444444444445 | 0 |
| 0.7576388888888889 | 0 |
| 0.7583333333333333 | 0 |
| 0.7590277777777777 | 0 |
| 0.7597222222222223 | 0 |
| 0.7604166666666666 | 0 |
| 0.7611111111111111 | 0 |
| 0.7618055555555556 | 0 |
| 0.7625000000000001 | 0 |
| 0.7631944444444444 | 0 |
| 0.7638888888888888 | 0 |
| 0.7645833333333334 | 0 |
| 0.7652777777777778 | 0 |
| 0.7659722222222222 | 0 |
| 0.7666666666666666 | 0 |
| 0.7673611111111112 | 0 |
| 0.7680555555555556 | 0 |
| 0.7687499999999999 | 0 |
| 0.7694444444444444 | 0 |
| 0.7701388888888889 | 0 |
| 0.7708333333333334 | 0 |
| 0.7715277777777777 | 0 |
| 0.7722222222222223 | 0 |
| 0.7729166666666667 | 0 |
| 0.7736111111111111 | 0 |
| 0.7743055555555555 | 0 |
| 0.775 | 0 |
| 0.7756944444444445 | 0 |
| 0.7763888888888889 | 0 |
| 0.7770833333333332 | 0 |
| 0.7777777777777778 | 0 |
| 0.7784722222222222 | 0 |
| 0.7791666666666667 | 0 |
| 0.779861111111111 | 0 |
| 0.7805555555555556 | 0 |
| 0.78125 | 0 |
| 0.7819444444444444 | 0 |
| 0.782638888888889 | 0 |
| 0.7833333333333333 | 0 |
| 0.7840277777777778 | 0 |
| 0.7847222222222222 | 0 |
| 0.7854166666666668 | 0 |
| 0.7861111111111111 | 0 |
| 0.7868055555555555 | 0 |
| 0.7875 | 0 |
| 0.7881944444444445 | 0 |
| 0.7888888888888889 | 0 |
| 0.7895833333333333 | 0 |
| 0.7902777777777777 | 0 |
| 0.7909722222222223 | 0 |
| 0.7916666666666666 | 0 |
| 0.7923611111111111 | 0 |
| 0.7930555555555556 | 0 |
| 0.7937500000000001 | 0 |
| 0.7944444444444444 | 0 |
| 0.7951388888888888 | 0 |
| 0.7958333333333334 | 0 |
| 0.7965277777777778 | 0 |
| 0.7972222222222222 | 0 |
| 0.7979166666666666 | 0 |
| 0.7986111111111112 | 0 |
| 0.7993055555555556 | 0 |
| 0.7999999999999999 | 0 |
| 0.8006944444444444 | 0 |
| 0.8013888888888889 | 0 |
| 0.8020833333333334 | 0 |
| 0.8027777777777777 | 0 |
| 0.8034722222222223 | 0 |
| 0.8041666666666667 | 0 |
| 0.8048611111111111 | 0 |
| 0.8055555555555555 | 0 |
| 0.80625 | 0 |
| 0.8069444444444445 | 0 |
| 0.8076388888888889 | 0 |
| 0.8083333333333332 | 0 |
| 0.8090277777777778 | 0 |
| 0.8097222222222222 | 0 |
| 0.8104166666666667 | 0 |
| 0.811111111111111 | 0 |
| 0.8118055555555556 | 0 |
| 0.8125 | 0 |
| 0.8131944444444444 | 0 |
| 0.813888888888889 | 0 |
| 0.8145833333333333 | 0 |
| 0.8152777777777778 | 0 |
| 0.8159722222222222 | 0 |
| 0.8166666666666668 | 0 |
| 0.8173611111111111 | 0 |
| 0.8180555555555555 | 0 |
| 0.81875 | 0 |
| 0.8194444444444445 | 0 |
| 0.8201388888888889 | 0 |
| 0.8208333333333333 | 0 |
| 0.8215277777777777 | 0 |
| 0.8222222222222223 | 0 |
| 0.8229166666666666 | 0 |
| 0.8236111111111111 | 0 |
| 0.8243055555555556 | 0 |
| 0.8250000000000001 | 0 |
| 0.8256944444444444 | 0 |
| 0.8263888888888888 | 0 |
| 0.8270833333333334 | 0 |
| 0.8277777777777778 | 0 |
| 0.8284722222222222 | 0 |
| 0.8291666666666666 | 0 |
| 0.8298611111111112 | 0 |
| 0.8305555555555556 | 0 |
| 0.8312499999999999 | 0 |
| 0.8319444444444444 | 0 |
| 0.8326388888888889 | 0 |
| 0.8333333333333334 | 0 |
| 0.8340277777777777 | 0 |
| 0.8347222222222223 | 0 |
| 0.8354166666666667 | 0 |
| 0.8361111111111111 | 0 |
| 0.8368055555555555 | 0 |
| 0.8375 | 0 |
| 0.8381944444444445 | 0 |
| 0.8388888888888889 | 0 |
| 0.8395833333333332 | 0 |
| 0.8402777777777778 | 0 |
| 0.8409722222222222 | 0 |
| 0.8416666666666667 | 0 |
| 0.842361111111111 | 0 |
| 0.8430555555555556 | 0 |
| 0.84375 | 0 |
| 0.8444444444444444 | 0 |
| 0.845138888888889 | 0 |
| 0.8458333333333333 | 0 |
| 0.8465277777777778 | 0 |
| 0.8472222222222222 | 0 |
| 0.8479166666666668 | 0 |
| 0.8486111111111111 | 0 |
| 0.8493055555555555 | 0 |
| 0.85 | 0 |
| 0.8506944444444445 | 0 |
| 0.8513888888888889 | 0 |
| 0.8520833333333333 | 0 |
| 0.8527777777777777 | 0 |
| 0.8534722222222223 | 0 |
| 0.8541666666666666 | 0 |
| 0.8548611111111111 | 0 |
| 0.8555555555555556 | 0 |
| 0.8562500000000001 | 0 |
| 0.8569444444444444 | 0 |
| 0.8576388888888888 | 0 |
| 0.8583333333333334 | 0 |
| 0.8590277777777778 | 0 |
| 0.8597222222222222 | 0 |
| 0.8604166666666666 | 0 |
| 0.8611111111111112 | 0 |
| 0.8618055555555556 | 0 |
| 0.8624999999999999 | 0 |
| 0.8631944444444444 | 0 |
| 0.8638888888888889 | 0 |
| 0.8645833333333334 | 0 |
| 0.8652777777777777 | 0 |
| 0.8659722222222223 | 0 |
| 0.8666666666666667 | 0 |
| 0.8673611111111111 | 0 |
| 0.8680555555555555 | 0 |
| 0.86875 | 0 |
| 0.8694444444444445 | 0 |
| 0.8701388888888889 | 0 |
| 0.8708333333333332 | 0 |
| 0.8715277777777778 | 0 |
| 0.8722222222222222 | 0 |
| 0.8729166666666667 | 0 |
| 0.873611111111111 | 0 |
| 0.8743055555555556 | 0 |
| 0.875 | 0 |
| 0.8756944444444444 | 0 |
| 0.876388888888889 | 0 |
| 0.8770833333333333 | 0 |
| 0.8777777777777778 | 0 |
| 0.8784722222222222 | 0 |
| 0.8791666666666668 | 0 |
| 0.8798611111111111 | 0 |
| 0.8805555555555555 | 0 |
| 0.88125 | 0 |
| 0.8819444444444445 | 0 |
| 0.8826388888888889 | 0 |
| 0.8833333333333333 | 0 |
| 0.8840277777777777 | 0 |
| 0.8847222222222223 | 0 |
| 0.8854166666666666 | 0 |
| 0.8861111111111111 | 0 |
| 0.8868055555555556 | 0 |
| 0.8875000000000001 | 0 |
| 0.8881944444444444 | 0 |
| 0.8888888888888888 | 0 |
| 0.8895833333333334 | 0 |
| 0.8902777777777778 | 0 |
| 0.8909722222222222 | 0 |
| 0.8916666666666666 | 0 |
| 0.8923611111111112 | 0 |
| 0.8930555555555556 | 0 |
| 0.8937499999999999 | 0 |
| 0.8944444444444444 | 0 |
| 0.8951388888888889 | 0 |
| 0.8958333333333334 | 0 |
| 0.8965277777777777 | 0 |
| 0.8972222222222223 | 0 |
| 0.8979166666666667 | 0 |
| 0.8986111111111111 | 0 |
| 0.8993055555555555 | 0 |
| 0.9 | 0 |
| 0.9006944444444445 | 0 |
| 0.9013888888888889 | 0 |
| 0.9020833333333332 | 0 |
| 0.9027777777777778 | 0 |
| 0.9034722222222222 | 0 |
| 0.9041666666666667 | 0 |
| 0.904861111111111 | 0 |
| 0.9055555555555556 | 0 |
| 0.90625 | 0 |
| 0.9069444444444444 | 0 |
| 0.907638888888889 | 0 |
| 0.9083333333333333 | 0 |
| 0.9090277777777778 | 0 |
| 0.9097222222222222 | 0 |
| 0.9104166666666668 | 0 |
| 0.9111111111111111 | 0 |
| 0.9118055555555555 | 0 |
| 0.9125 | 0 |
| 0.9131944444444445 | 0 |
| 0.9138888888888889 | 0 |
| 0.9145833333333333 | 0 |
| 0.9152777777777777 | 0 |
| 0.9159722222222223 | 0 |
| 0.9166666666666666 | 0 |
| 0.9173611111111111 | 0 |
| 0.9180555555555556 | 0 |
| 0.9187500000000001 | 0 |
| 0.9194444444444444 | 0 |
| 0.9201388888888888 | 0 |
| 0.9208333333333334 | 0 |
| 0.9215277777777778 | 0 |
| 0.9222222222222222 | 0 |
| 0.9229166666666666 | 0 |
| 0.9236111111111112 | 0 |
| 0.9243055555555556 | 0 |
| 0.9249999999999999 | 0 |
| 0.9256944444444444 | 0 |
| 0.9263888888888889 | 0 |
| 0.9270833333333334 | 0 |
| 0.9277777777777777 | 0 |
| 0.9284722222222223 | 0 |
| 0.9291666666666667 | 0 |
| 0.9298611111111111 | 0 |
| 0.9305555555555555 | 0 |
| 0.93125 | 0 |
| 0.9319444444444445 | 0 |
| 0.9326388888888889 | 0 |
| 0.9333333333333332 | 0 |
| 0.9340277777777778 | 0 |
| 0.9347222222222222 | 0 |
| 0.9354166666666667 | 0 |
| 0.936111111111111 | 0 |
| 0.9368055555555556 | 0 |
| 0.9375 | 0 |
| 0.9381944444444444 | 0 |
| 0.938888888888889 | 0 |
| 0.9395833333333333 | 0 |
| 0.9402777777777778 | 0 |
| 0.9409722222222222 | 0 |
| 0.9416666666666668 | 0 |
| 0.9423611111111111 | 0 |
| 0.9430555555555555 | 0 |
| 0.94375 | 0 |
| 0.9444444444444445 | 0 |
| 0.9451388888888889 | 0 |
| 0.9458333333333333 | 0 |
| 0.9465277777777777 | 0 |
| 0.9472222222222223 | 0 |
| 0.9479166666666666 | 0 |
| 0.9486111111111111 | 0 |
| 0.9493055555555556 | 0 |
| 0.9500000000000001 | 0 |
| 0.9506944444444444 | 0 |
| 0.9513888888888888 | 0 |
| 0.9520833333333334 | 0 |
| 0.9527777777777778 | 0 |
| 0.9534722222222222 | 0 |
| 0.9541666666666666 | 0 |
| 0.9548611111111112 | 0 |
| 0.9555555555555556 | 0 |
| 0.9562499999999999 | 0 |
| 0.9569444444444444 | 0 |
| 0.9576388888888889 | 0 |
| 0.9583333333333334 | 0 |
| 0.9590277777777777 | 0 |
| 0.9597222222222223 | 0 |
| 0.9604166666666667 | 0 |
| 0.9611111111111111 | 0 |
| 0.9618055555555555 | 0 |
| 0.9625 | 0 |
| 0.9631944444444445 | 0 |
| 0.9638888888888889 | 0 |
| 0.9645833333333332 | 0 |
| 0.9652777777777778 | 0 |
| 0.9659722222222222 | 0 |
| 0.9666666666666667 | 0 |
| 0.967361111111111 | 0 |
| 0.9680555555555556 | 0 |
| 0.96875 | 0 |
| 0.9694444444444444 | 0 |
| 0.970138888888889 | 0 |
| 0.9708333333333333 | 0 |
| 0.9715277777777778 | 0 |
| 0.9722222222222222 | 0 |
| 0.9729166666666668 | 0 |
| 0.9736111111111111 | 0 |
| 0.9743055555555555 | 0 |
| 0.975 | 0 |
| 0.9756944444444445 | 0 |
| 0.9763888888888889 | 0 |
| 0.9770833333333333 | 0 |
| 0.9777777777777777 | 0 |
| 0.9784722222222223 | 0 |
| 0.9791666666666666 | 0 |
| 0.9798611111111111 | 0 |
| 0.9805555555555556 | 0 |
| 0.9812500000000001 | 0 |
| 0.9819444444444444 | 0 |
| 0.9826388888888888 | 0 |
| 0.9833333333333334 | 0 |
| 0.9840277777777778 | 0 |
| 0.9847222222222222 | 0 |
| 0.9854166666666666 | 0 |
| 0.9861111111111112 | 0 |
| 0.9868055555555556 | 0 |
| 0.9874999999999999 | 0 |
| 0.9881944444444444 | 0 |
| 0.9888888888888889 | 0 |
| 0.9895833333333334 | 0 |
| 0.9902777777777777 | 0 |
| 0.9909722222222223 | 0 |
| 0.9916666666666667 | 0 |
| 0.9923611111111111 | 0 |
| 0.9930555555555555 | 0 |
| 0.99375 | 0 |
| 0.9944444444444445 | 0 |
| 0.9951388888888889 | 0 |
| 0.9958333333333332 | 0 |
| 0.9965277777777778 | 0 |
| 0.9972222222222222 | 0 |
| 0.9979166666666667 | 0 |
| 0.998611111111111 | 0 |
| 0.9993055555555556 | 0 |